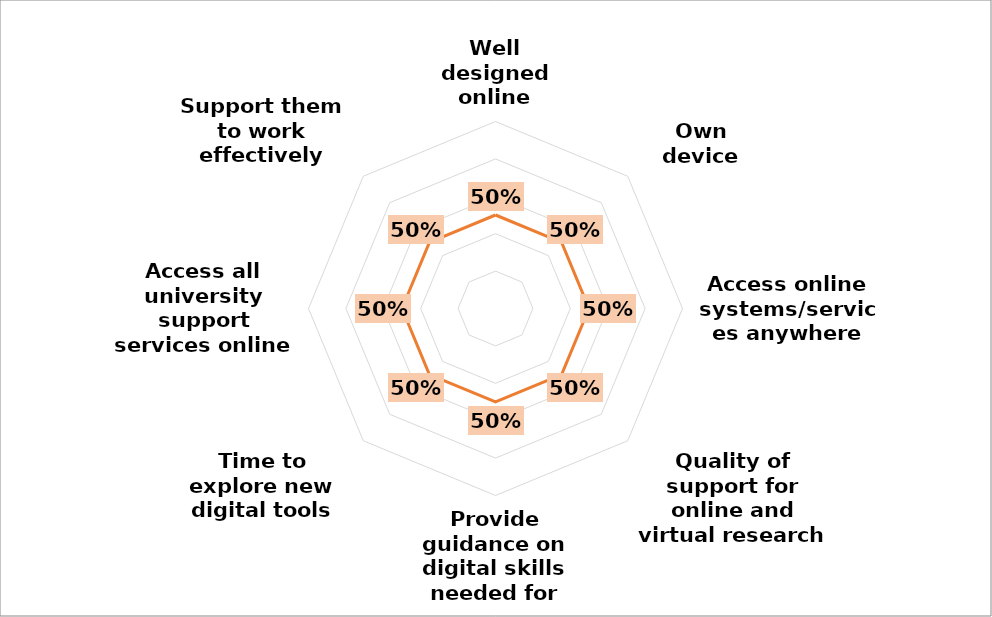
| Category | Percentage |
|---|---|
| Well designed online working environment | 0.5 |
| Own device support | 0.5 |
| Access online systems/services anywhere | 0.5 |
| Quality of support for online and virtual research | 0.5 |
| Provide guidance on digital skills needed for their research roles | 0.5 |
| Time to explore new digital tools and approaches | 0.5 |
| Access all university support services online | 0.5 |
| Support them to work effectively online | 0.5 |